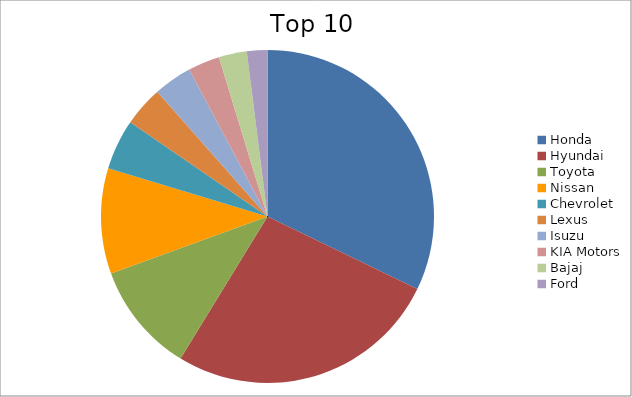
| Category | Series 0 |
|---|---|
| Honda | 32.18 |
| Hyundai | 26.56 |
| Toyota | 10.7 |
| Nissan | 10.24 |
| Chevrolet | 4.9 |
| Lexus | 3.9 |
| Isuzu | 3.72 |
| KIA Motors | 3.08 |
| Bajaj | 2.72 |
| Ford | 1.99 |